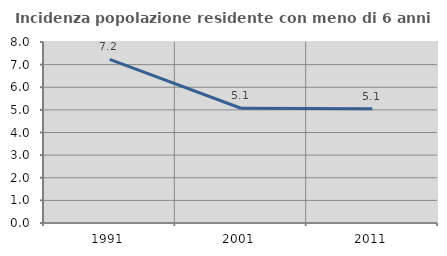
| Category | Incidenza popolazione residente con meno di 6 anni |
|---|---|
| 1991.0 | 7.231 |
| 2001.0 | 5.071 |
| 2011.0 | 5.052 |